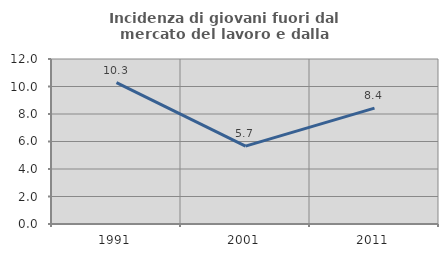
| Category | Incidenza di giovani fuori dal mercato del lavoro e dalla formazione  |
|---|---|
| 1991.0 | 10.281 |
| 2001.0 | 5.665 |
| 2011.0 | 8.43 |